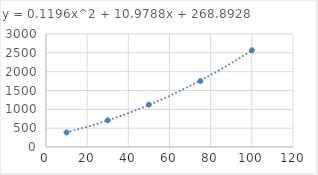
| Category | Series 0 |
|---|---|
| 10.0 | 387 |
| 30.0 | 709 |
| 50.0 | 1126 |
| 75.0 | 1751 |
| 100.0 | 2568 |